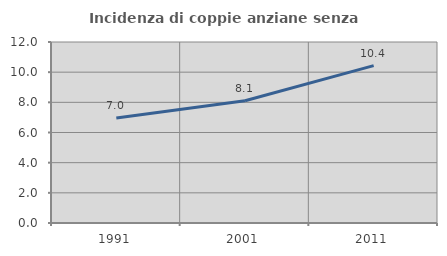
| Category | Incidenza di coppie anziane senza figli  |
|---|---|
| 1991.0 | 6.964 |
| 2001.0 | 8.109 |
| 2011.0 | 10.435 |